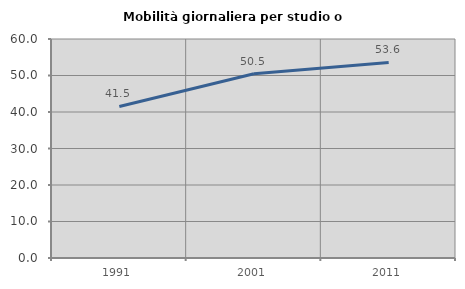
| Category | Mobilità giornaliera per studio o lavoro |
|---|---|
| 1991.0 | 41.512 |
| 2001.0 | 50.489 |
| 2011.0 | 53.565 |